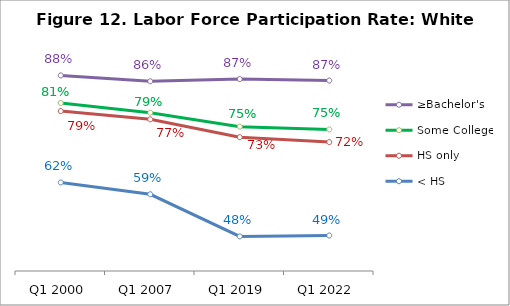
| Category | ≥Bachelor's | Some College | HS only | < HS |
|---|---|---|---|---|
| Q1 2000 | 0.879 | 0.811 | 0.792 | 0.617 |
| Q1 2007 | 0.865 | 0.788 | 0.771 | 0.588 |
| Q1 2019 | 0.87 | 0.754 | 0.728 | 0.485 |
| Q1 2022 | 0.866 | 0.747 | 0.716 | 0.487 |